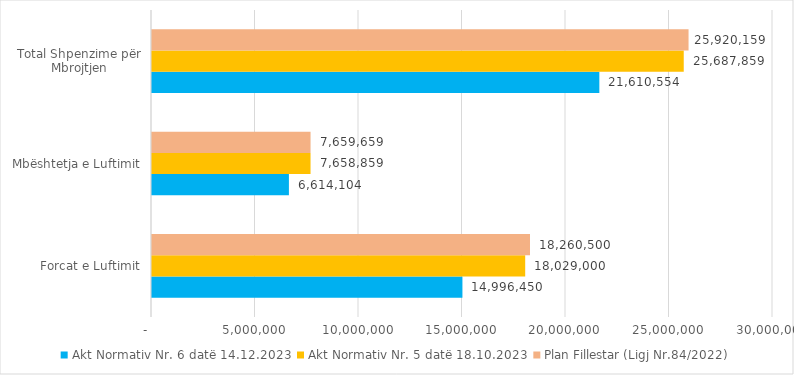
| Category | Akt Normativ Nr. 6 datë 14.12.2023 | Akt Normativ Nr. 5 datë 18.10.2023 | Plan Fillestar (Ligj Nr.84/2022) |
|---|---|---|---|
| Forcat e Luftimit | 14996450 | 18029000 | 18260500 |
| Mbështetja e Luftimit | 6614104 | 7658859 | 7659659 |
| Total Shpenzime për Mbrojtjen | 21610554 | 25687859 | 25920159 |